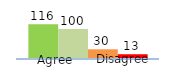
| Category | Series 0 | Series 1 | Series 2 | Series 3 |
|---|---|---|---|---|
| 0 | 116 | 100 | 30 | 13 |